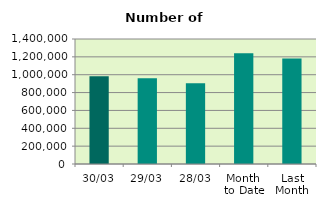
| Category | Series 0 |
|---|---|
| 30/03 | 983674 |
| 29/03 | 960968 |
| 28/03 | 905000 |
| Month 
to Date | 1240974.273 |
| Last
Month | 1180310.4 |